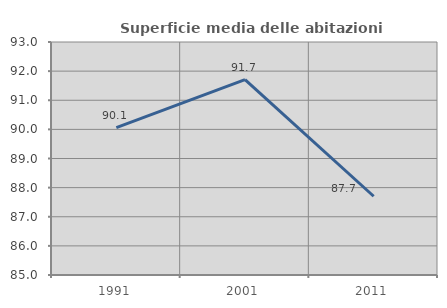
| Category | Superficie media delle abitazioni occupate |
|---|---|
| 1991.0 | 90.059 |
| 2001.0 | 91.709 |
| 2011.0 | 87.704 |